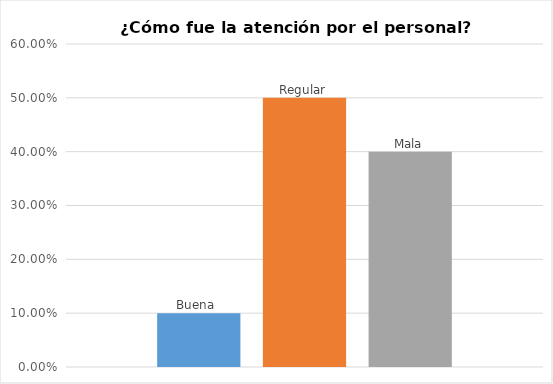
| Category | Buena  | Regular | Mala |
|---|---|---|---|
| 0 | 0.1 | 0.5 | 0.4 |